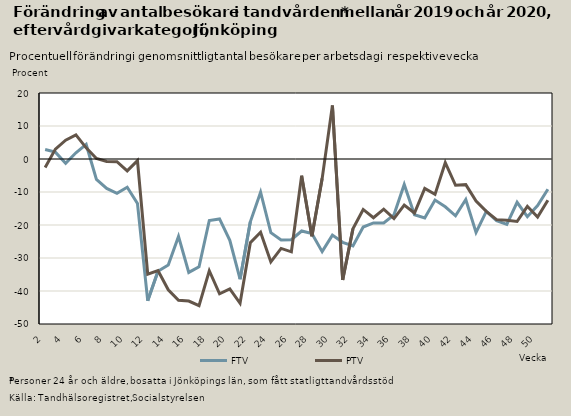
| Category | FTV | PTV |
|---|---|---|
| 2.0 | 2.89 | -2.597 |
| 3.0 | 2.089 | 3.001 |
| 4.0 | -1.275 | 5.714 |
| 5.0 | 1.886 | 7.295 |
| 6.0 | 4.407 | 3.387 |
| 7.0 | -6.186 | 0.16 |
| 8.0 | -8.907 | -0.75 |
| 9.0 | -10.392 | -0.807 |
| 10.0 | -8.549 | -3.593 |
| 11.0 | -13.487 | -0.498 |
| 12.0 | -42.976 | -34.882 |
| 13.0 | -34.03 | -33.783 |
| 14.0 | -32.102 | -39.643 |
| 15.0 | -23.461 | -42.815 |
| 16.0 | -34.37 | -43.056 |
| 17.0 | -32.646 | -44.459 |
| 18.0 | -18.647 | -33.866 |
| 19.0 | -18.165 | -40.838 |
| 20.0 | -24.649 | -39.343 |
| 21.0 | -36.431 | -43.724 |
| 22.0 | -19.038 | -25.373 |
| 23.0 | -10.066 | -22.182 |
| 24.0 | -22.307 | -31.177 |
| 25.0 | -24.508 | -27.092 |
| 26.0 | -24.441 | -28.125 |
| 27.0 | -21.821 | -5.041 |
| 28.0 | -22.573 | -23.442 |
| 29.0 | -28.076 | -5.935 |
| 30.0 | -23.061 | 16.21 |
| 31.0 | -25.241 | -36.671 |
| 32.0 | -26.344 | -21.166 |
| 33.0 | -20.62 | -15.284 |
| 34.0 | -19.384 | -17.785 |
| 35.0 | -19.405 | -15.203 |
| 36.0 | -16.908 | -18.058 |
| 37.0 | -7.727 | -13.985 |
| 38.0 | -16.889 | -16.371 |
| 39.0 | -17.866 | -8.939 |
| 40.0 | -12.439 | -10.71 |
| 41.0 | -14.49 | -1.114 |
| 42.0 | -17.208 | -7.959 |
| 43.0 | -12.261 | -7.772 |
| 44.0 | -22.241 | -12.728 |
| 45.0 | -15.871 | -15.878 |
| 46.0 | -18.718 | -18.372 |
| 47.0 | -19.829 | -18.584 |
| 48.0 | -13.132 | -18.938 |
| 49.0 | -17.487 | -14.34 |
| 50.0 | -14.128 | -17.577 |
| 51.0 | -9.164 | -12.526 |